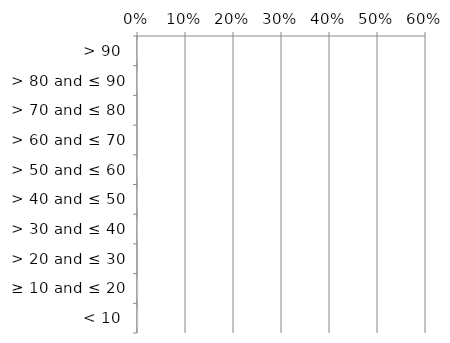
| Category | Not determinable |
|---|---|
| < 10 | 0.001 |
| ≥ 10 and ≤ 20 | 0 |
| > 20 and ≤ 30 | 0 |
| > 30 and ≤ 40 | 0 |
| > 40 and ≤ 50 | 0 |
| > 50 and ≤ 60 | 0 |
| > 60 and ≤ 70 | 0 |
| > 70 and ≤ 80 | 0 |
| > 80 and ≤ 90 | 0 |
| > 90 | 0 |